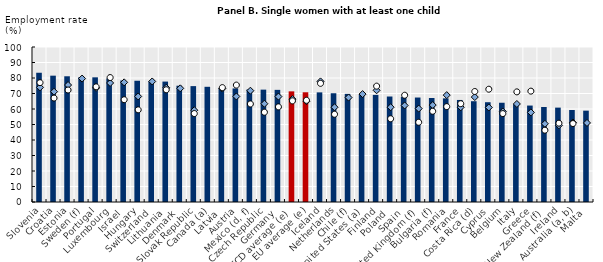
| Category | Series 1 |
|---|---|
| Slovenia | 83.44 |
| Croatia | 81.504 |
| Estonia | 81.115 |
| Sweden (f) | 80.471 |
| Portugal | 80.436 |
| Luxembourg | 79.685 |
| Israel | 78.397 |
| Hungary | 78.227 |
| Switzerland | 77.712 |
| Lithuania | 77.692 |
| Denmark | 75.025 |
| Slovak Republic | 74.765 |
| Canada (a) | 74.325 |
| Latvia | 73.433 |
| Austria | 73.27 |
| Mexico (d, f) | 72.595 |
| Czech Republic | 72.49 |
| Germany | 72.348 |
| OECD average (e) | 71.386 |
| EU average (e) | 70.786 |
| Iceland | 70.729 |
| Netherlands | 70.17 |
| Chile (f) | 69.767 |
| United States (a) | 69.606 |
| Finland | 69.102 |
| Poland | 68.058 |
| Spain | 67.746 |
| United Kingdom (f) | 67.403 |
| Bulgaria (f) | 67.097 |
| Romania | 66.874 |
| France | 65.833 |
| Costa Rica (d) | 65.029 |
| Cyprus | 64.378 |
| Belgium | 64.037 |
| Italy | 63.087 |
| Greece | 62.219 |
| New Zealand (f) | 61.297 |
| Ireland | 60.893 |
| Australia (a, b) | 59.367 |
| Malta | 58.933 |